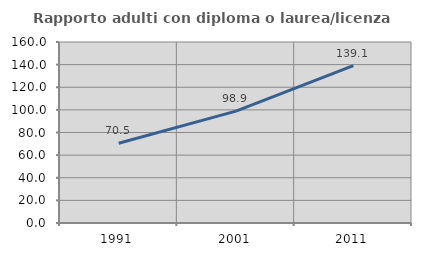
| Category | Rapporto adulti con diploma o laurea/licenza media  |
|---|---|
| 1991.0 | 70.54 |
| 2001.0 | 98.859 |
| 2011.0 | 139.141 |